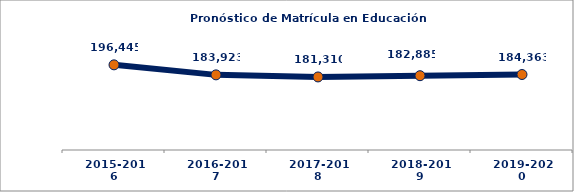
| Category | Series 1 |
|---|---|
| 2015-2016 | 196445.039 |
| 2016-2017 | 183923.165 |
| 2017-2018 | 181309.923 |
| 2018-2019 | 182884.847 |
| 2019-2020 | 184362.917 |